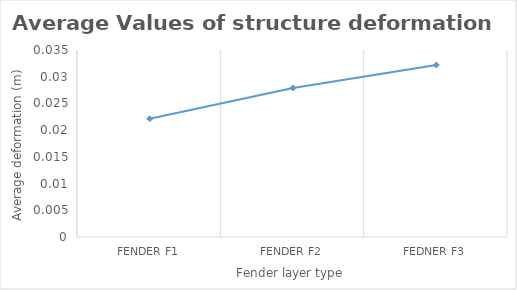
| Category | Average Values |
|---|---|
| Fender F1 | 0.022 |
| Fender F2 | 0.028 |
| Fedner F3 | 0.032 |